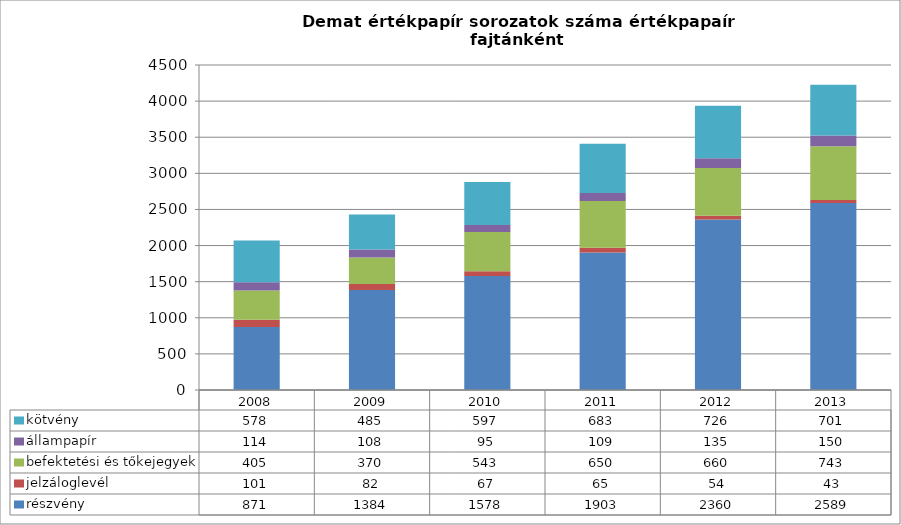
| Category | részvény | jelzáloglevél | befektetési és tőkejegyek | állampapír | kötvény |
|---|---|---|---|---|---|
| 2008.0 | 871 | 101 | 405 | 114 | 578 |
| 2009.0 | 1384 | 82 | 370 | 108 | 485 |
| 2010.0 | 1578 | 67 | 543 | 95 | 597 |
| 2011.0 | 1903 | 65 | 650 | 109 | 683 |
| 2012.0 | 2360 | 54 | 660 | 135 | 726 |
| 2013.0 | 2589 | 43 | 743 | 150 | 701 |